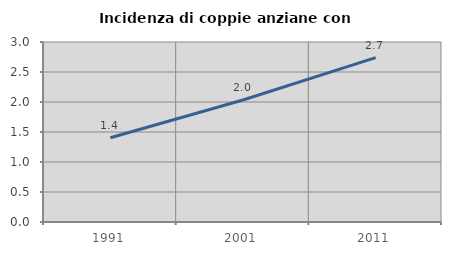
| Category | Incidenza di coppie anziane con figli |
|---|---|
| 1991.0 | 1.404 |
| 2001.0 | 2.034 |
| 2011.0 | 2.74 |